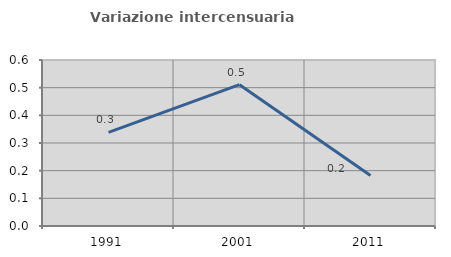
| Category | Variazione intercensuaria annua |
|---|---|
| 1991.0 | 0.338 |
| 2001.0 | 0.511 |
| 2011.0 | 0.182 |